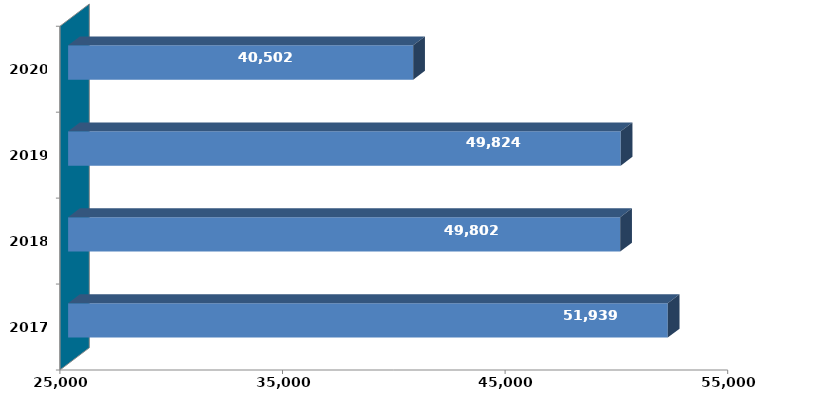
| Category |  Column2  |
|---|---|
| 2017 | 51938940 |
| 2018 | 49801606 |
| 2019 | 49824372 |
| 2020 | 40501918 |